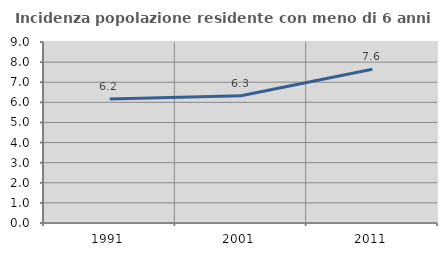
| Category | Incidenza popolazione residente con meno di 6 anni |
|---|---|
| 1991.0 | 6.168 |
| 2001.0 | 6.326 |
| 2011.0 | 7.643 |